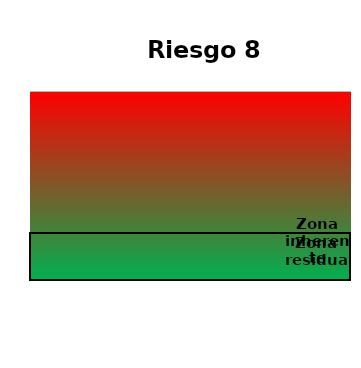
| Category | Zona  | Zona Residual | Zona inherente |
|---|---|---|---|
| Riesgo 8 | 4 | 1 | 1 |